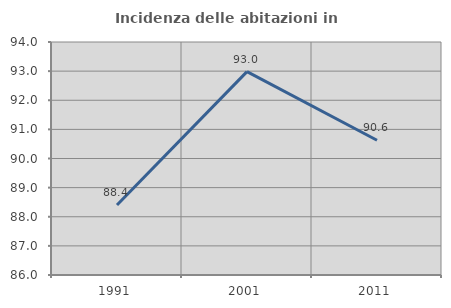
| Category | Incidenza delle abitazioni in proprietà  |
|---|---|
| 1991.0 | 88.406 |
| 2001.0 | 92.982 |
| 2011.0 | 90.625 |